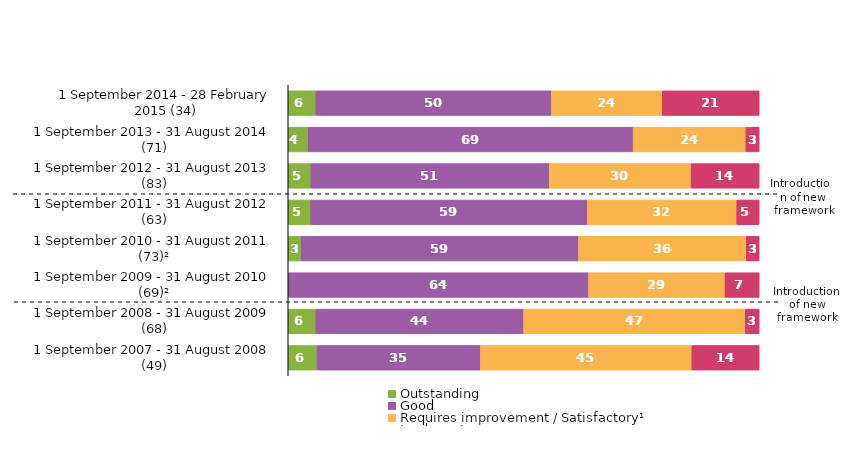
| Category | Outstanding | Good | Requires improvement / Satisfactory¹ | Inadequate |
|---|---|---|---|---|
| 1 September 2014 - 28 February 2015 (34) | 5.882 | 50 | 23.529 | 20.588 |
| 1 September 2013 - 31 August 2014 (71) | 4.225 | 69.014 | 23.944 | 2.817 |
| 1 September 2012 - 31 August 2013 (83) | 4.819 | 50.602 | 30.12 | 14.458 |
| 1 September 2011 - 31 August 2012 (63) | 4.762 | 58.73 | 31.746 | 4.762 |
| 1 September 2010 - 31 August 2011 (73)² | 2.74 | 58.904 | 35.616 | 2.74 |
| 1 September 2009 - 31 August 2010 (69)² | 0 | 63.768 | 28.986 | 7.246 |
| 1 September 2008 - 31 August 2009 (68) | 5.882 | 44.118 | 47.059 | 2.941 |
| 1 September 2007 - 31 August 2008 (49) | 6.122 | 34.694 | 44.898 | 14.286 |